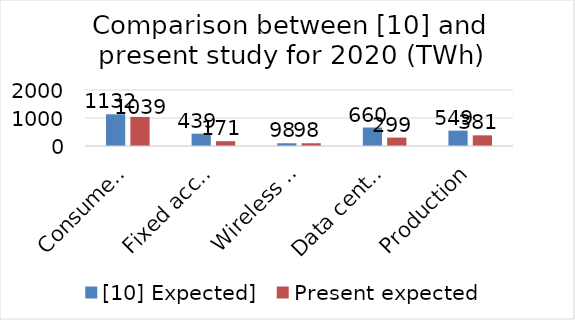
| Category | [10] Expected] | Present expected |
|---|---|---|
| Consumer devices use | 1131.8 | 1038.523 |
| Fixed access wired use | 439.335 | 171.228 |
| Wireless networks access use | 98.075 | 98.075 |
| Data centers use | 660.01 | 299.428 |
| Production | 548.998 | 380.726 |